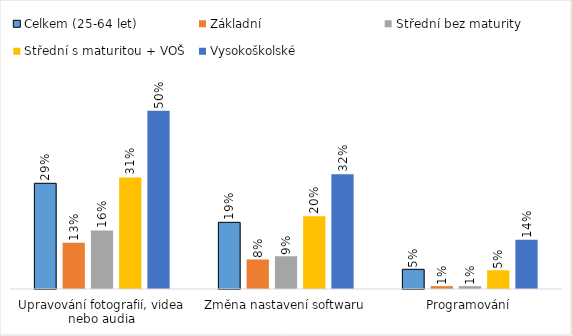
| Category | Celkem (25-64 let) | Základní | Střední bez maturity | Střední s maturitou + VOŠ | Vysokoškolské |
|---|---|---|---|---|---|
| Upravování fotografií, videa nebo audia | 0.294 | 0.129 | 0.163 | 0.31 | 0.495 |
| Změna nastavení softwaru | 0.185 | 0.082 | 0.091 | 0.202 | 0.319 |
| Programování | 0.055 | 0.008 | 0.008 | 0.052 | 0.137 |